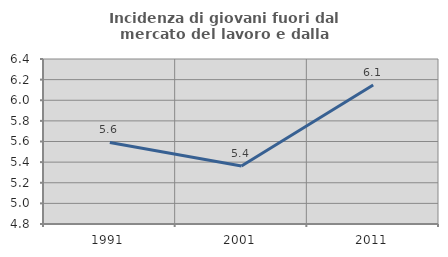
| Category | Incidenza di giovani fuori dal mercato del lavoro e dalla formazione  |
|---|---|
| 1991.0 | 5.591 |
| 2001.0 | 5.363 |
| 2011.0 | 6.148 |